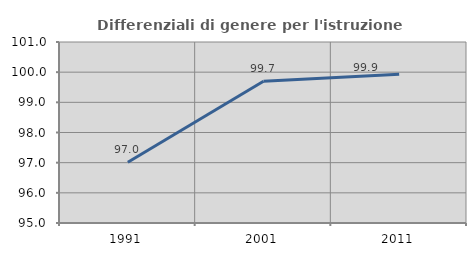
| Category | Differenziali di genere per l'istruzione superiore |
|---|---|
| 1991.0 | 97.013 |
| 2001.0 | 99.699 |
| 2011.0 | 99.93 |